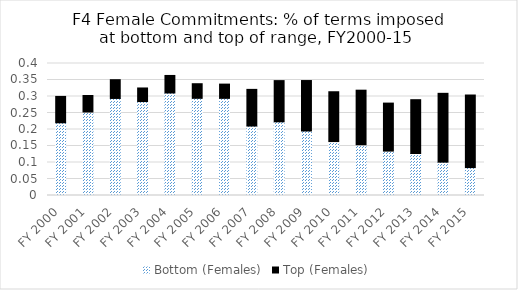
| Category | Bottom (Females) | Top (Females) |
|---|---|---|
| FY 2000 | 0.22 | 0.08 |
| FY 2001 | 0.253 | 0.05 |
| FY 2002 | 0.294 | 0.057 |
| FY 2003 | 0.285 | 0.041 |
| FY 2004 | 0.311 | 0.053 |
| FY 2005 | 0.295 | 0.044 |
| FY 2006 | 0.294 | 0.043 |
| FY 2007 | 0.21 | 0.111 |
| FY 2008 | 0.223 | 0.125 |
| FY 2009 | 0.195 | 0.153 |
| FY 2010 | 0.163 | 0.151 |
| FY 2011 | 0.153 | 0.166 |
| FY 2012 | 0.135 | 0.145 |
| FY 2013 | 0.127 | 0.163 |
| FY 2014 | 0.101 | 0.209 |
| FY 2015 | 0.085 | 0.22 |